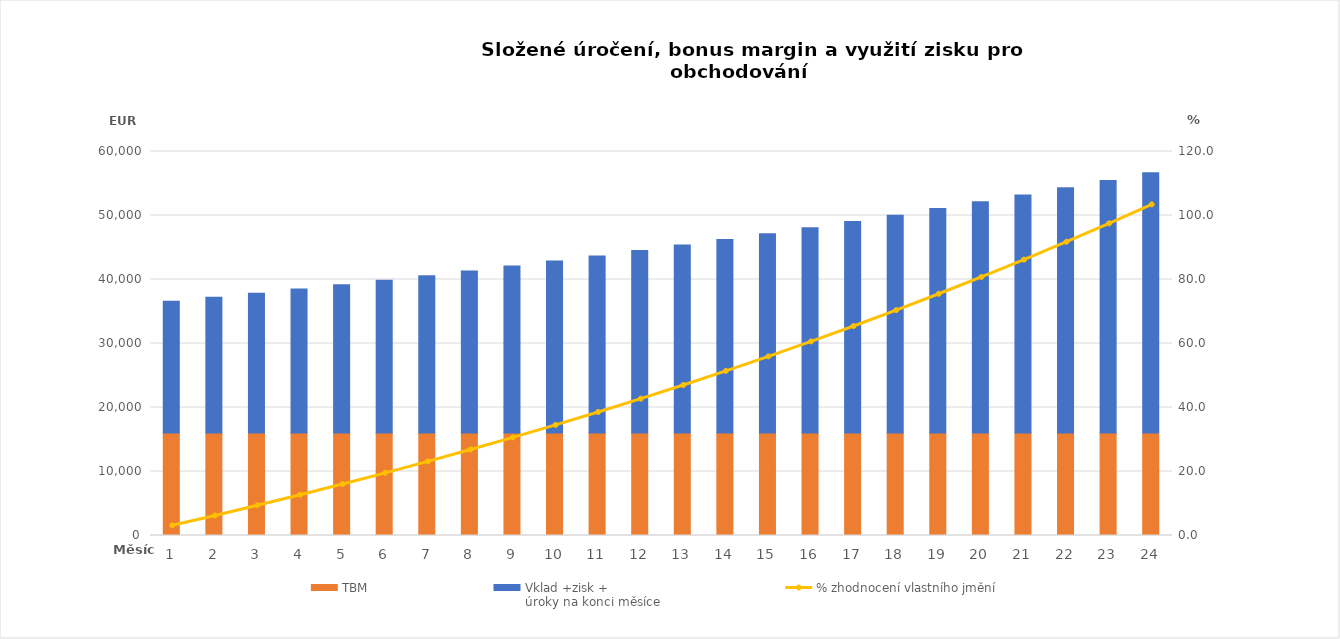
| Category | TBM | Vklad +zisk +
úroky na konci měsíce |
|---|---|---|
| 1.0 | 16000 | 20604 |
| 2.0 | 16000 | 21222.12 |
| 3.0 | 16000 | 21858.784 |
| 4.0 | 16000 | 22514.547 |
| 5.0 | 16000 | 23189.984 |
| 6.0 | 16000 | 23885.683 |
| 7.0 | 16000 | 24602.254 |
| 8.0 | 16000 | 25340.321 |
| 9.0 | 16000 | 26100.531 |
| 10.0 | 16000 | 26883.547 |
| 11.0 | 16000 | 27690.053 |
| 12.0 | 16000 | 28520.755 |
| 13.0 | 16000 | 29376.377 |
| 14.0 | 16000 | 30257.669 |
| 15.0 | 16000 | 31165.399 |
| 16.0 | 16000 | 32100.361 |
| 17.0 | 16000 | 33063.371 |
| 18.0 | 16000 | 34055.273 |
| 19.0 | 16000 | 35076.931 |
| 20.0 | 16000 | 36129.239 |
| 21.0 | 16000 | 37213.116 |
| 22.0 | 16000 | 38329.509 |
| 23.0 | 16000 | 39479.395 |
| 24.0 | 16000 | 40663.776 |